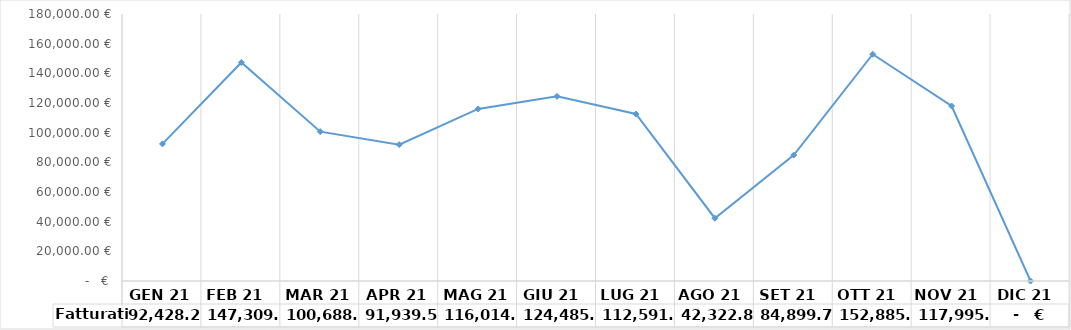
| Category | Fatturati |
|---|---|
|  GEN 21   | 92428.29 |
|  FEB 21   | 147309.36 |
|  MAR 21   | 100688.444 |
|  APR 21   | 91939.504 |
|  MAG 21   | 116014.85 |
| GIU 21  | 124485.249 |
| LUG 21  | 112591.11 |
| AGO 21  | 42322.876 |
| SET 21  | 84899.708 |
| OTT 21  | 152885.735 |
| NOV 21  | 117995.712 |
| DIC 21  | 0 |